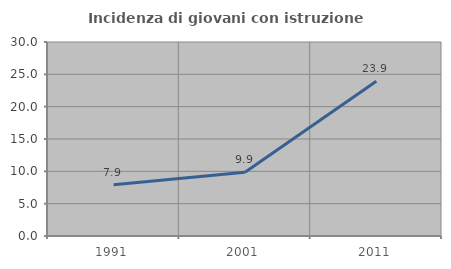
| Category | Incidenza di giovani con istruzione universitaria |
|---|---|
| 1991.0 | 7.937 |
| 2001.0 | 9.859 |
| 2011.0 | 23.932 |